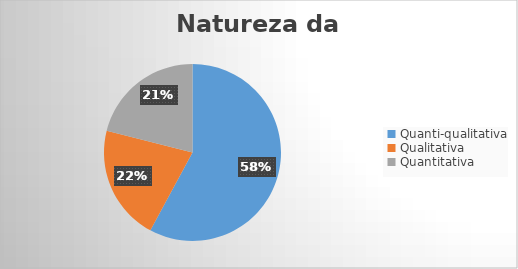
| Category | Series 0 |
|---|---|
| Quanti-qualitativa | 11 |
| Qualitativa | 4 |
| Quantitativa | 4 |